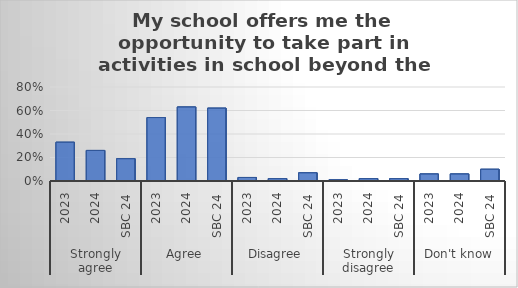
| Category | My school offers me the opportunity to take part in activities in school beyond the classroom and timetabled day. |
|---|---|
| 0 | 0.33 |
| 1 | 0.26 |
| 2 | 0.19 |
| 3 | 0.54 |
| 4 | 0.63 |
| 5 | 0.62 |
| 6 | 0.03 |
| 7 | 0.02 |
| 8 | 0.07 |
| 9 | 0.01 |
| 10 | 0.02 |
| 11 | 0.02 |
| 12 | 0.06 |
| 13 | 0.06 |
| 14 | 0.1 |